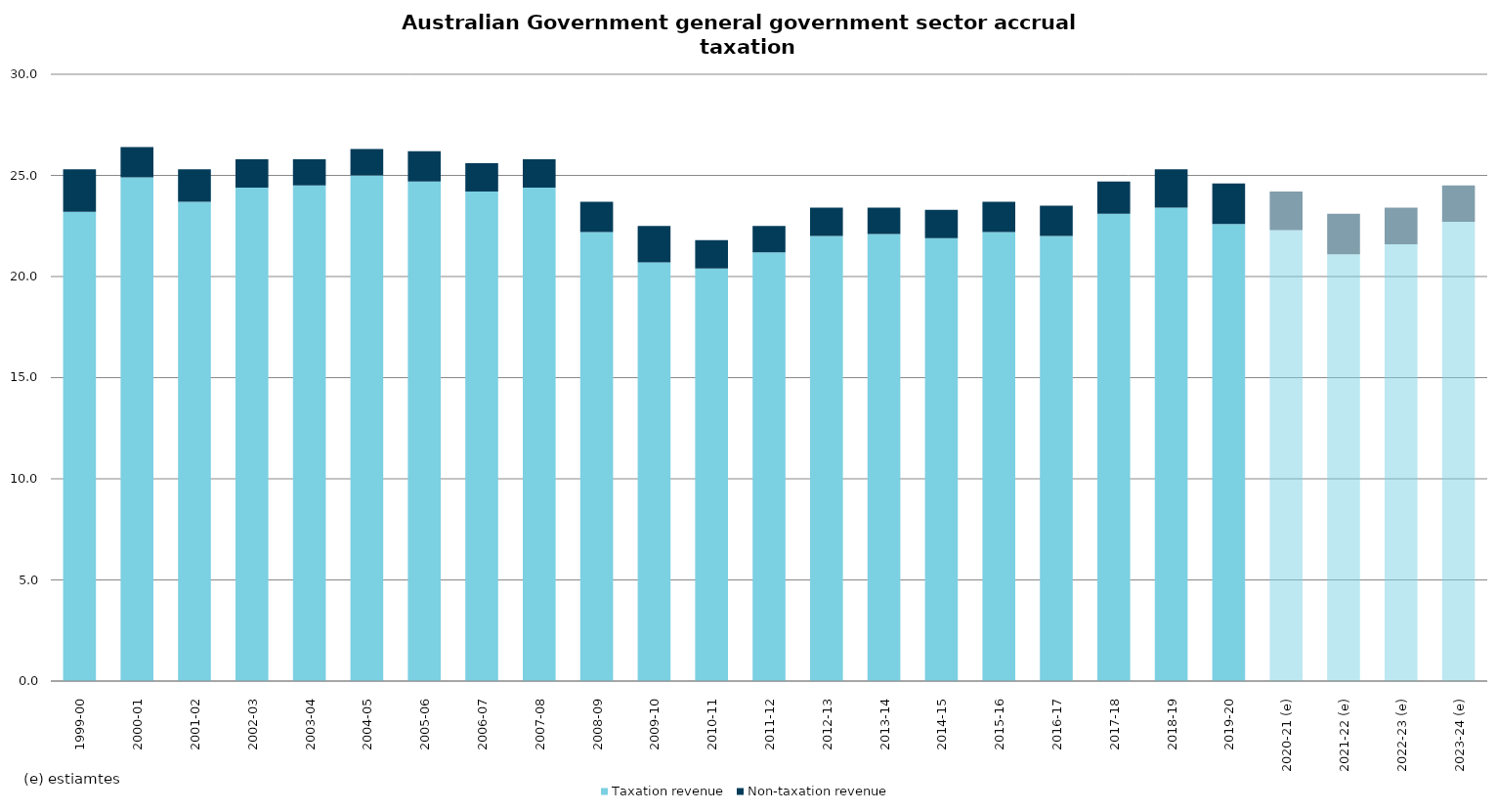
| Category | Taxation revenue | Non-taxation revenue |
|---|---|---|
| 1999-00 | 23.2 | 2.1 |
| 2000-01 | 24.9 | 1.5 |
| 2001-02 | 23.7 | 1.6 |
| 2002-03 | 24.4 | 1.4 |
| 2003-04 | 24.5 | 1.3 |
| 2004-05 | 25 | 1.3 |
| 2005-06 | 24.7 | 1.5 |
| 2006-07 | 24.2 | 1.4 |
| 2007-08 | 24.4 | 1.4 |
| 2008-09 | 22.2 | 1.5 |
| 2009-10 | 20.7 | 1.8 |
| 2010-11 | 20.4 | 1.4 |
| 2011-12 | 21.2 | 1.3 |
| 2012-13 | 22 | 1.4 |
| 2013-14 | 22.1 | 1.3 |
| 2014-15 | 21.9 | 1.4 |
| 2015-16 | 22.2 | 1.5 |
| 2016-17 | 22 | 1.5 |
| 2017-18 | 23.1 | 1.6 |
| 2018-19 | 23.4 | 1.9 |
| 2019-20 | 22.6 | 2 |
| 2020-21 (e) | 22.3 | 1.9 |
| 2021-22 (e) | 21.1 | 2 |
| 2022-23 (e) | 21.6 | 1.8 |
| 2023-24 (e) | 22.7 | 1.8 |